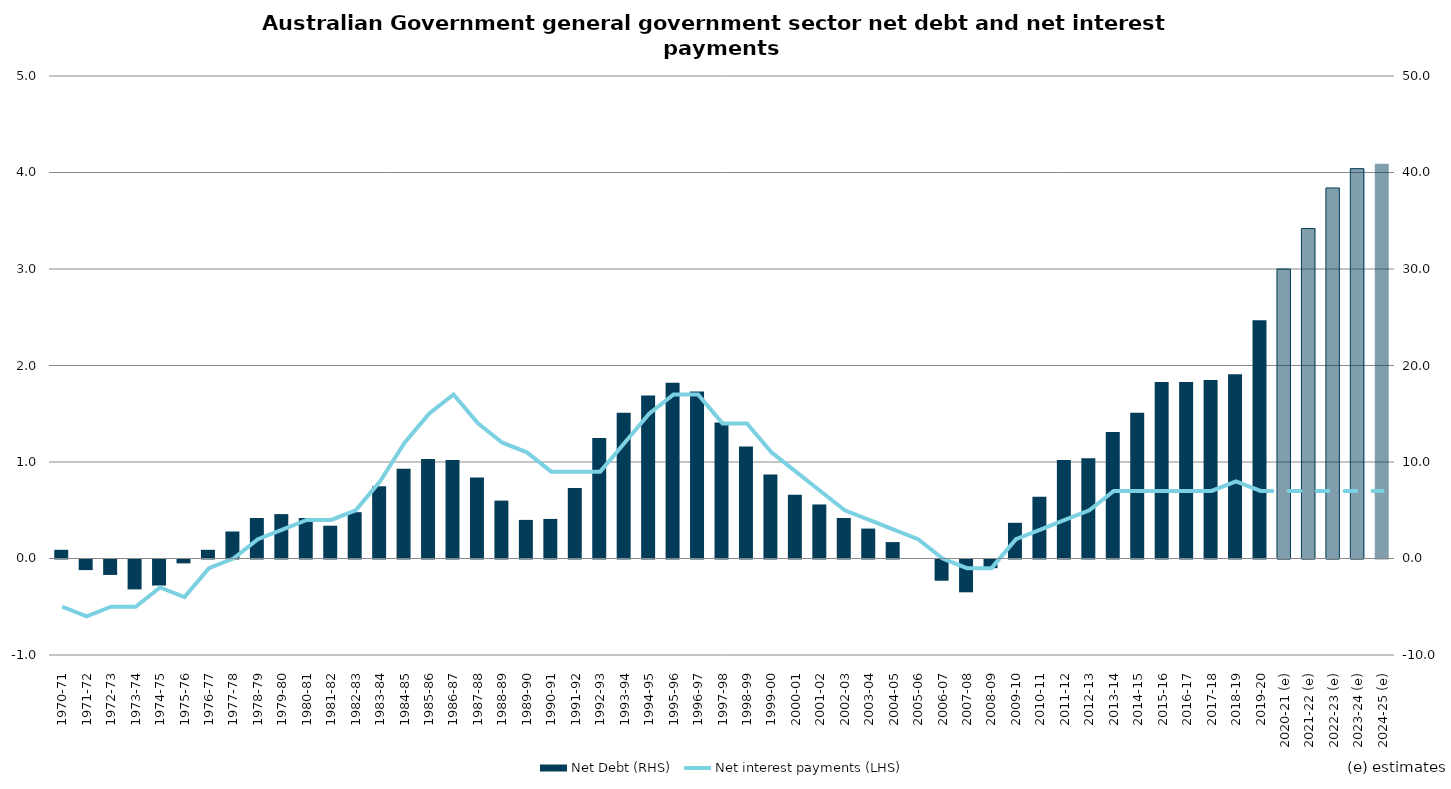
| Category | Net Debt (RHS) |
|---|---|
| 1970-71 | 0.9 |
| 1971-72 | -1.1 |
| 1972-73 | -1.6 |
| 1973-74 | -3.1 |
| 1974-75 | -2.7 |
| 1975-76 | -0.4 |
| 1976-77 | 0.9 |
| 1977-78 | 2.8 |
| 1978-79 | 4.2 |
| 1979-80 | 4.6 |
| 1980-81 | 4.2 |
| 1981-82 | 3.4 |
| 1982-83 | 4.8 |
| 1983-84 | 7.5 |
| 1984-85 | 9.3 |
| 1985-86 | 10.3 |
| 1986-87 | 10.2 |
| 1987-88 | 8.4 |
| 1988-89 | 6 |
| 1989-90 | 4 |
| 1990-91 | 4.1 |
| 1991-92 | 7.3 |
| 1992-93 | 12.5 |
| 1993-94 | 15.1 |
| 1994-95 | 16.9 |
| 1995-96 | 18.2 |
| 1996-97 | 17.3 |
| 1997-98 | 14.1 |
| 1998-99 | 11.6 |
| 1999-00 | 8.7 |
| 2000-01 | 6.6 |
| 2001-02 | 5.6 |
| 2002-03 | 4.2 |
| 2003-04 | 3.1 |
| 2004-05 | 1.7 |
| 2005-06 | 0 |
| 2006-07 | -2.2 |
| 2007-08 | -3.4 |
| 2008-09 | -0.9 |
| 2009-10 | 3.7 |
| 2010-11 | 6.4 |
| 2011-12 | 10.2 |
| 2012-13 | 10.4 |
| 2013-14 | 13.1 |
| 2014-15 | 15.1 |
| 2015-16 | 18.3 |
| 2016-17 | 18.3 |
| 2017-18 | 18.5 |
| 2018-19 | 19.1 |
| 2019-20 | 24.7 |
| 2020-21 (e) | 30 |
| 2021-22 (e) | 34.2 |
| 2022-23 (e) | 38.4 |
| 2023-24 (e) | 40.4 |